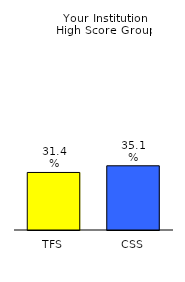
| Category | Series 0 |
|---|---|
| TFS | 0.314 |
| CSS | 0.351 |